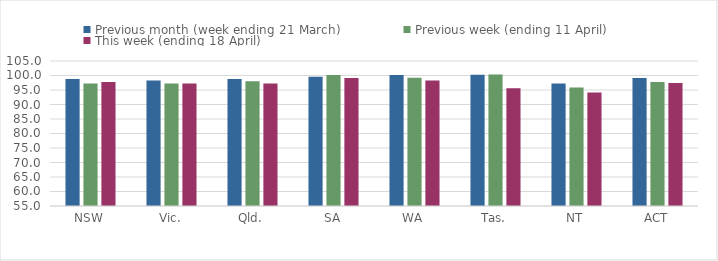
| Category | Previous month (week ending 21 March) | Previous week (ending 11 April) | This week (ending 18 April) |
|---|---|---|---|
| NSW | 98.771 | 97.251 | 97.786 |
| Vic. | 98.273 | 97.253 | 97.255 |
| Qld. | 98.769 | 97.983 | 97.202 |
| SA | 99.609 | 100.209 | 99.112 |
| WA | 100.188 | 99.197 | 98.268 |
| Tas. | 100.234 | 100.312 | 95.579 |
| NT | 97.2 | 95.88 | 94.16 |
| ACT | 99.104 | 97.761 | 97.4 |